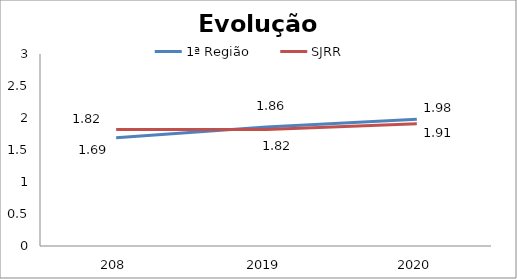
| Category | 1ª Região | SJRR |
|---|---|---|
| 0 | 1.69 | 1.82 |
| 1 | 1.86 | 1.82 |
| 2 | 1.98 | 1.91 |